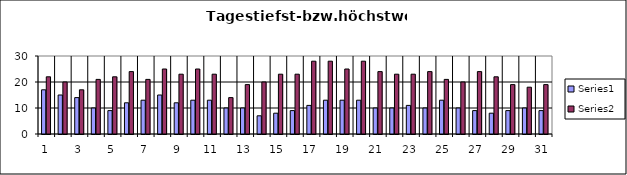
| Category | Series 0 | Series 1 |
|---|---|---|
| 0 | 17 | 22 |
| 1 | 15 | 20 |
| 2 | 14 | 17 |
| 3 | 10 | 21 |
| 4 | 9 | 22 |
| 5 | 12 | 24 |
| 6 | 13 | 21 |
| 7 | 15 | 25 |
| 8 | 12 | 23 |
| 9 | 13 | 25 |
| 10 | 13 | 23 |
| 11 | 10 | 14 |
| 12 | 10 | 19 |
| 13 | 7 | 20 |
| 14 | 8 | 23 |
| 15 | 9 | 23 |
| 16 | 11 | 28 |
| 17 | 13 | 28 |
| 18 | 13 | 25 |
| 19 | 13 | 28 |
| 20 | 10 | 24 |
| 21 | 10 | 23 |
| 22 | 11 | 23 |
| 23 | 10 | 24 |
| 24 | 13 | 21 |
| 25 | 10 | 20 |
| 26 | 9 | 24 |
| 27 | 8 | 22 |
| 28 | 9 | 19 |
| 29 | 10 | 18 |
| 30 | 9 | 19 |